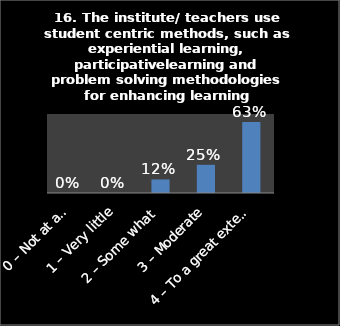
| Category | Series 0 |
|---|---|
| 0 – Not at all | 0 |
| 1 – Very little | 0 |
| 2 – Some what | 0.12 |
| 3 – Moderate | 0.25 |
| 4 – To a great extent | 0.63 |